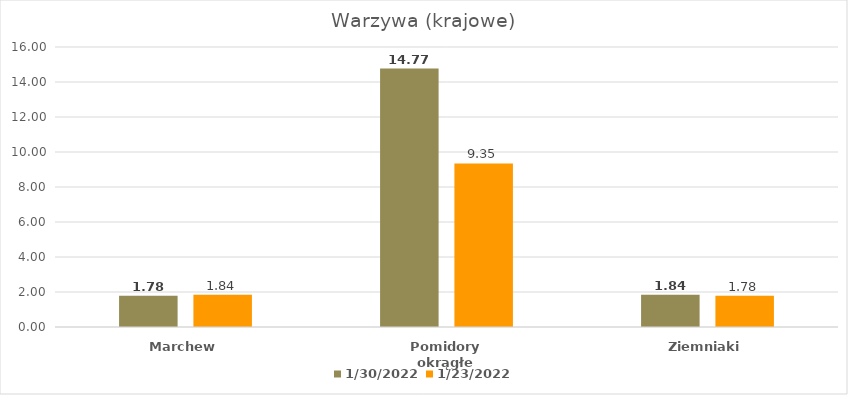
| Category | 2022-01-30 | 2022-01-23 |
|---|---|---|
| Marchew | 1.78 | 1.84 |
| Pomidory okrągłe | 14.77 | 9.35 |
| Ziemniaki | 1.84 | 1.78 |